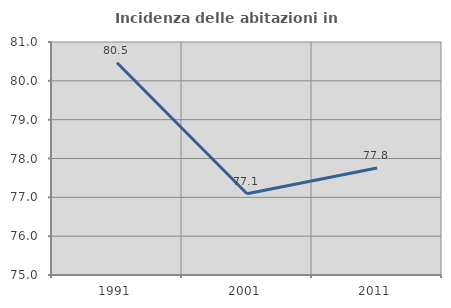
| Category | Incidenza delle abitazioni in proprietà  |
|---|---|
| 1991.0 | 80.464 |
| 2001.0 | 77.094 |
| 2011.0 | 77.758 |